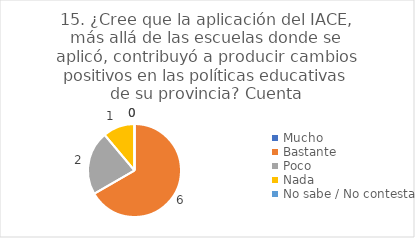
| Category | 15. ¿Cree que la aplicación del IACE, más allá de las escuelas donde se aplicó, contribuyó a producir cambios positivos en las políticas educativas de su provincia? |
|---|---|
| Mucho  | 0 |
| Bastante  | 0.667 |
| Poco  | 0.222 |
| Nada  | 0.111 |
| No sabe / No contesta | 0 |